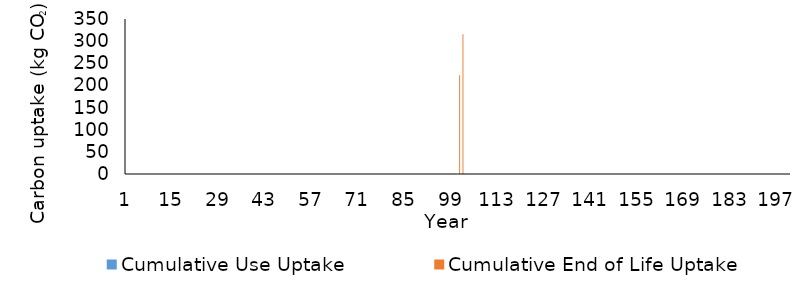
| Category | Cumulative Use Uptake | Cumulative End of Life Uptake |
|---|---|---|
| 0 | 0 | 0 |
| 1 | 0 | 0 |
| 2 | 0 | 0 |
| 3 | 0 | 0 |
| 4 | 0 | 0 |
| 5 | 0 | 0 |
| 6 | 0 | 0 |
| 7 | 0 | 0 |
| 8 | 0 | 0 |
| 9 | 0 | 0 |
| 10 | 0 | 0 |
| 11 | 0 | 0 |
| 12 | 0 | 0 |
| 13 | 0 | 0 |
| 14 | 0 | 0 |
| 15 | 0 | 0 |
| 16 | 0 | 0 |
| 17 | 0 | 0 |
| 18 | 0 | 0 |
| 19 | 0 | 0 |
| 20 | 0 | 0 |
| 21 | 0 | 0 |
| 22 | 0 | 0 |
| 23 | 0 | 0 |
| 24 | 0 | 0 |
| 25 | 0 | 0 |
| 26 | 0 | 0 |
| 27 | 0 | 0 |
| 28 | 0 | 0 |
| 29 | 0 | 0 |
| 30 | 0 | 0 |
| 31 | 0 | 0 |
| 32 | 0 | 0 |
| 33 | 0 | 0 |
| 34 | 0 | 0 |
| 35 | 0 | 0 |
| 36 | 0 | 0 |
| 37 | 0 | 0 |
| 38 | 0 | 0 |
| 39 | 0 | 0 |
| 40 | 0 | 0 |
| 41 | 0 | 0 |
| 42 | 0 | 0 |
| 43 | 0 | 0 |
| 44 | 0 | 0 |
| 45 | 0 | 0 |
| 46 | 0 | 0 |
| 47 | 0 | 0 |
| 48 | 0 | 0 |
| 49 | 0 | 0 |
| 50 | 0 | 0 |
| 51 | 0 | 0 |
| 52 | 0 | 0 |
| 53 | 0 | 0 |
| 54 | 0 | 0 |
| 55 | 0 | 0 |
| 56 | 0 | 0 |
| 57 | 0 | 0 |
| 58 | 0 | 0 |
| 59 | 0 | 0 |
| 60 | 0 | 0 |
| 61 | 0 | 0 |
| 62 | 0 | 0 |
| 63 | 0 | 0 |
| 64 | 0 | 0 |
| 65 | 0 | 0 |
| 66 | 0 | 0 |
| 67 | 0 | 0 |
| 68 | 0 | 0 |
| 69 | 0 | 0 |
| 70 | 0 | 0 |
| 71 | 0 | 0 |
| 72 | 0 | 0 |
| 73 | 0 | 0 |
| 74 | 0 | 0 |
| 75 | 0 | 0 |
| 76 | 0 | 0 |
| 77 | 0 | 0 |
| 78 | 0 | 0 |
| 79 | 0 | 0 |
| 80 | 0 | 0 |
| 81 | 0 | 0 |
| 82 | 0 | 0 |
| 83 | 0 | 0 |
| 84 | 0 | 0 |
| 85 | 0 | 0 |
| 86 | 0 | 0 |
| 87 | 0 | 0 |
| 88 | 0 | 0 |
| 89 | 0 | 0 |
| 90 | 0 | 0 |
| 91 | 0 | 0 |
| 92 | 0 | 0 |
| 93 | 0 | 0 |
| 94 | 0 | 0 |
| 95 | 0 | 0 |
| 96 | 0 | 0 |
| 97 | 0 | 0 |
| 98 | 0 | 0 |
| 99 | 0 | 0 |
| 100 | 0 | 223.003 |
| 101 | 0 | 315.374 |
| 102 | 0 | 0 |
| 103 | 0 | 0 |
| 104 | 0 | 0 |
| 105 | 0 | 0 |
| 106 | 0 | 0 |
| 107 | 0 | 0 |
| 108 | 0 | 0 |
| 109 | 0 | 0 |
| 110 | 0 | 0 |
| 111 | 0 | 0 |
| 112 | 0 | 0 |
| 113 | 0 | 0 |
| 114 | 0 | 0 |
| 115 | 0 | 0 |
| 116 | 0 | 0 |
| 117 | 0 | 0 |
| 118 | 0 | 0 |
| 119 | 0 | 0 |
| 120 | 0 | 0 |
| 121 | 0 | 0 |
| 122 | 0 | 0 |
| 123 | 0 | 0 |
| 124 | 0 | 0 |
| 125 | 0 | 0 |
| 126 | 0 | 0 |
| 127 | 0 | 0 |
| 128 | 0 | 0 |
| 129 | 0 | 0 |
| 130 | 0 | 0 |
| 131 | 0 | 0 |
| 132 | 0 | 0 |
| 133 | 0 | 0 |
| 134 | 0 | 0 |
| 135 | 0 | 0 |
| 136 | 0 | 0 |
| 137 | 0 | 0 |
| 138 | 0 | 0 |
| 139 | 0 | 0 |
| 140 | 0 | 0 |
| 141 | 0 | 0 |
| 142 | 0 | 0 |
| 143 | 0 | 0 |
| 144 | 0 | 0 |
| 145 | 0 | 0 |
| 146 | 0 | 0 |
| 147 | 0 | 0 |
| 148 | 0 | 0 |
| 149 | 0 | 0 |
| 150 | 0 | 0 |
| 151 | 0 | 0 |
| 152 | 0 | 0 |
| 153 | 0 | 0 |
| 154 | 0 | 0 |
| 155 | 0 | 0 |
| 156 | 0 | 0 |
| 157 | 0 | 0 |
| 158 | 0 | 0 |
| 159 | 0 | 0 |
| 160 | 0 | 0 |
| 161 | 0 | 0 |
| 162 | 0 | 0 |
| 163 | 0 | 0 |
| 164 | 0 | 0 |
| 165 | 0 | 0 |
| 166 | 0 | 0 |
| 167 | 0 | 0 |
| 168 | 0 | 0 |
| 169 | 0 | 0 |
| 170 | 0 | 0 |
| 171 | 0 | 0 |
| 172 | 0 | 0 |
| 173 | 0 | 0 |
| 174 | 0 | 0 |
| 175 | 0 | 0 |
| 176 | 0 | 0 |
| 177 | 0 | 0 |
| 178 | 0 | 0 |
| 179 | 0 | 0 |
| 180 | 0 | 0 |
| 181 | 0 | 0 |
| 182 | 0 | 0 |
| 183 | 0 | 0 |
| 184 | 0 | 0 |
| 185 | 0 | 0 |
| 186 | 0 | 0 |
| 187 | 0 | 0 |
| 188 | 0 | 0 |
| 189 | 0 | 0 |
| 190 | 0 | 0 |
| 191 | 0 | 0 |
| 192 | 0 | 0 |
| 193 | 0 | 0 |
| 194 | 0 | 0 |
| 195 | 0 | 0 |
| 196 | 0 | 0 |
| 197 | 0 | 0 |
| 198 | 0 | 0 |
| 199 | 0 | 0 |